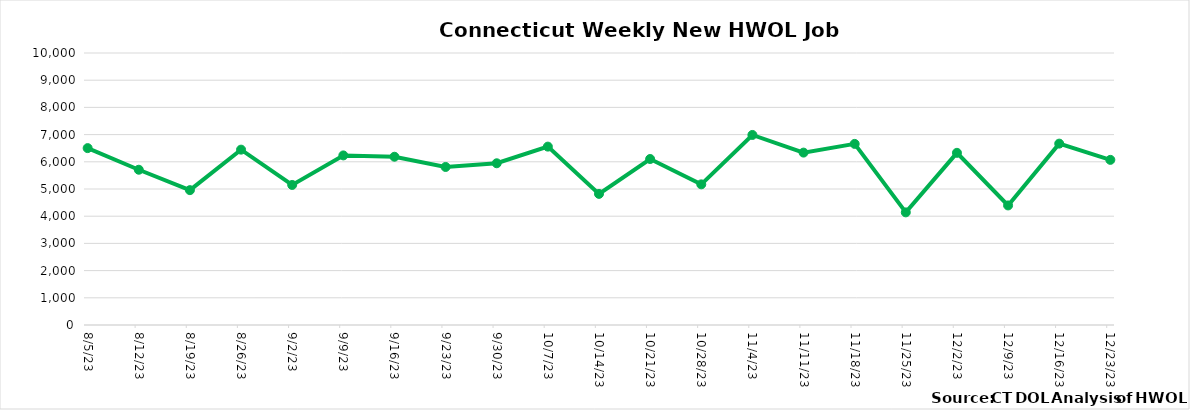
| Category | Connecticut |
|---|---|
| 8/5/23 | 6503 |
| 8/12/23 | 5708 |
| 8/19/23 | 4958 |
| 8/26/23 | 6447 |
| 9/2/23 | 5149 |
| 9/9/23 | 6235 |
| 9/16/23 | 6186 |
| 9/23/23 | 5810 |
| 9/30/23 | 5946 |
| 10/7/23 | 6558 |
| 10/14/23 | 4820 |
| 10/21/23 | 6103 |
| 10/28/23 | 5171 |
| 11/4/23 | 6987 |
| 11/11/23 | 6338 |
| 11/18/23 | 6658 |
| 11/25/23 | 4141 |
| 12/2/23 | 6330 |
| 12/9/23 | 4396 |
| 12/16/23 | 6668 |
| 12/23/23 | 6071 |